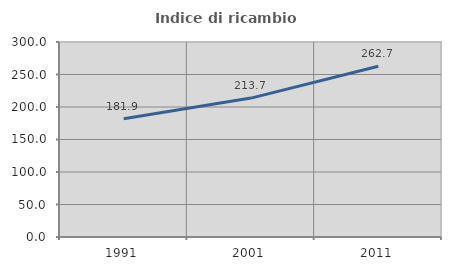
| Category | Indice di ricambio occupazionale  |
|---|---|
| 1991.0 | 181.928 |
| 2001.0 | 213.699 |
| 2011.0 | 262.687 |